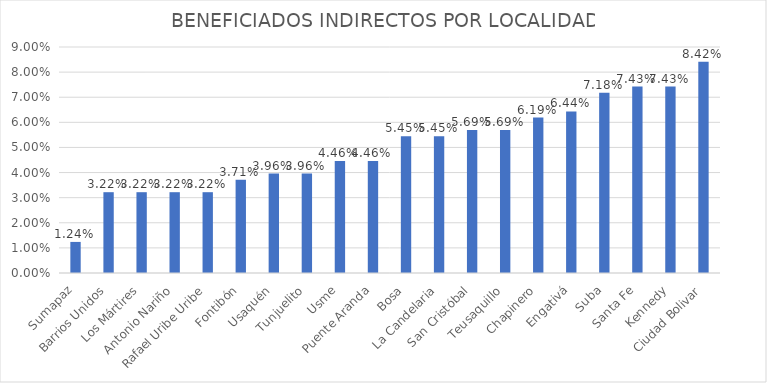
| Category | % |
|---|---|
| Sumapaz | 0.012 |
| Barrios Unidos | 0.032 |
| Los Mártires | 0.032 |
| Antonio Nariño | 0.032 |
| Rafael Uribe Uribe | 0.032 |
| Fontibón | 0.037 |
| Usaquén | 0.04 |
| Tunjuelito | 0.04 |
| Usme | 0.045 |
| Puente Aranda | 0.045 |
| Bosa | 0.054 |
| La Candelaria | 0.054 |
| San Cristóbal | 0.057 |
| Teusaquillo | 0.057 |
| Chapinero | 0.062 |
| Engativá | 0.064 |
| Suba | 0.072 |
| Santa Fe | 0.074 |
| Kennedy | 0.074 |
| Ciudad Bolivar | 0.084 |